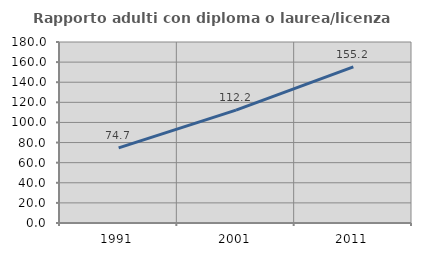
| Category | Rapporto adulti con diploma o laurea/licenza media  |
|---|---|
| 1991.0 | 74.733 |
| 2001.0 | 112.188 |
| 2011.0 | 155.241 |